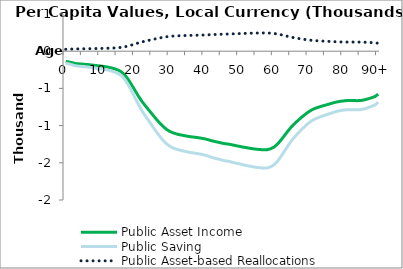
| Category | Public Asset Income | Public Saving | Public Asset-based Reallocations |
|---|---|---|---|
| 0 | -136.874 | -162.184 | 25.31 |
|  | -144.872 | -171.661 | 26.789 |
| 2 | -156.629 | -185.592 | 28.963 |
| 3 | -166.62 | -197.431 | 30.81 |
| 4 | -170.99 | -202.609 | 31.619 |
| 5 | -174.386 | -206.632 | 32.246 |
| 6 | -178.139 | -211.08 | 32.94 |
| 7 | -182.597 | -216.362 | 33.765 |
| 8 | -188.866 | -223.789 | 34.924 |
| 9 | -194.004 | -229.878 | 35.874 |
| 10 | -199.373 | -236.24 | 36.867 |
| 11 | -204.88 | -242.765 | 37.885 |
| 12 | -212.96 | -252.34 | 39.379 |
| 13 | -222.669 | -263.844 | 41.175 |
| 14 | -235.745 | -279.337 | 43.593 |
| 15 | -252.441 | -299.121 | 46.68 |
| 16 | -276.641 | -327.796 | 51.155 |
| 17 | -318.647 | -377.57 | 58.922 |
| 18 | -380.132 | -450.424 | 70.292 |
| 19 | -453.687 | -537.581 | 83.893 |
| 20 | -532.156 | -630.56 | 98.403 |
| 21 | -609.003 | -721.617 | 112.614 |
| 22 | -678.199 | -803.608 | 125.409 |
| 23 | -738.115 | -874.604 | 136.488 |
| 24 | -794.763 | -941.726 | 146.963 |
| 25 | -852.277 | -1009.876 | 157.598 |
| 26 | -908.93 | -1077.005 | 168.074 |
| 27 | -961.975 | -1139.858 | 177.883 |
| 28 | -1010.023 | -1196.791 | 186.768 |
| 29 | -1049.968 | -1244.123 | 194.154 |
| 30 | -1079.381 | -1278.974 | 199.593 |
| 31 | -1099.131 | -1302.377 | 203.245 |
| 32 | -1113.549 | -1319.46 | 205.911 |
| 33 | -1124.218 | -1332.102 | 207.884 |
| 34 | -1133.202 | -1342.748 | 209.546 |
| 35 | -1142.34 | -1353.575 | 211.235 |
| 36 | -1150.062 | -1362.725 | 212.663 |
| 37 | -1155.602 | -1369.29 | 213.688 |
| 38 | -1161.613 | -1376.412 | 214.799 |
| 39 | -1169.074 | -1385.252 | 216.179 |
| 40 | -1177.792 | -1395.583 | 217.791 |
| 41 | -1189.462 | -1409.411 | 219.949 |
| 42 | -1203.19 | -1425.678 | 222.487 |
| 43 | -1214.407 | -1438.969 | 224.562 |
| 44 | -1224.487 | -1450.912 | 226.425 |
| 45 | -1235.439 | -1463.889 | 228.451 |
| 46 | -1243.772 | -1473.763 | 229.991 |
| 47 | -1249.775 | -1480.876 | 231.101 |
| 48 | -1259.48 | -1492.376 | 232.896 |
| 49 | -1270.108 | -1504.969 | 234.861 |
| 50 | -1278.401 | -1514.796 | 236.395 |
| 51 | -1287.708 | -1525.824 | 238.116 |
| 52 | -1296.462 | -1536.196 | 239.735 |
| 53 | -1304.324 | -1545.513 | 241.189 |
| 54 | -1312.151 | -1554.787 | 242.636 |
| 55 | -1317.839 | -1561.527 | 243.688 |
| 56 | -1322.246 | -1566.749 | 244.503 |
| 57 | -1326.006 | -1571.204 | 245.198 |
| 58 | -1324.131 | -1568.982 | 244.851 |
| 59 | -1311.869 | -1554.452 | 242.584 |
| 60 | -1288.341 | -1526.574 | 238.233 |
| 61 | -1247.811 | -1478.549 | 230.738 |
| 62 | -1193.378 | -1414.051 | 220.673 |
| 63 | -1133.371 | -1342.947 | 209.577 |
| 64 | -1072.402 | -1270.704 | 198.303 |
| 65 | -1015.831 | -1203.673 | 187.842 |
| 66 | -968.587 | -1147.692 | 179.106 |
| 67 | -925.601 | -1096.758 | 171.157 |
| 68 | -884.83 | -1048.448 | 163.618 |
| 69 | -847.361 | -1004.05 | 156.689 |
| 70 | -813.103 | -963.457 | 150.354 |
| 71 | -785.017 | -930.178 | 145.161 |
| 72 | -765.287 | -906.799 | 141.513 |
| 73 | -749.669 | -888.293 | 138.625 |
| 74 | -735.379 | -871.361 | 135.982 |
| 75 | -722.255 | -855.811 | 133.556 |
| 76 | -708.494 | -839.505 | 131.011 |
| 77 | -694.515 | -822.941 | 128.426 |
| 78 | -683.156 | -809.482 | 126.326 |
| 79 | -673.84 | -798.443 | 124.603 |
| 80 | -668.158 | -791.71 | 123.552 |
| 81 | -663.614 | -786.326 | 122.712 |
| 82 | -663.356 | -786.02 | 122.664 |
| 83 | -664.024 | -786.812 | 122.788 |
| 84 | -664.559 | -787.446 | 122.887 |
| 85 | -662.578 | -785.098 | 122.52 |
| 86 | -654.369 | -775.371 | 121.002 |
| 87 | -641.129 | -759.683 | 118.554 |
| 88 | -626.887 | -742.808 | 115.921 |
| 89 | -610.682 | -723.606 | 112.924 |
| 90+ | -577.903 | -684.765 | 106.863 |